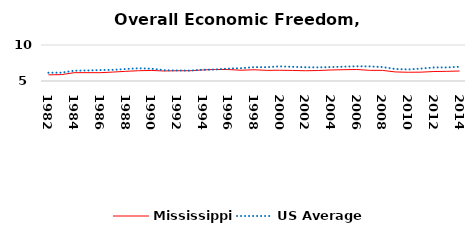
| Category | Mississippi | US Average |
|---|---|---|
| 1982.0 | 5.855 | 6.149 |
| 1983.0 | 5.883 | 6.152 |
| 1984.0 | 6.155 | 6.429 |
| 1985.0 | 6.158 | 6.464 |
| 1986.0 | 6.153 | 6.512 |
| 1987.0 | 6.238 | 6.552 |
| 1988.0 | 6.342 | 6.659 |
| 1989.0 | 6.428 | 6.767 |
| 1990.0 | 6.469 | 6.71 |
| 1991.0 | 6.391 | 6.502 |
| 1992.0 | 6.425 | 6.463 |
| 1993.0 | 6.426 | 6.446 |
| 1994.0 | 6.531 | 6.563 |
| 1995.0 | 6.606 | 6.593 |
| 1996.0 | 6.59 | 6.73 |
| 1997.0 | 6.494 | 6.781 |
| 1998.0 | 6.562 | 6.926 |
| 1999.0 | 6.478 | 6.925 |
| 2000.0 | 6.494 | 7.031 |
| 2001.0 | 6.466 | 6.969 |
| 2002.0 | 6.425 | 6.912 |
| 2003.0 | 6.457 | 6.892 |
| 2004.0 | 6.531 | 6.934 |
| 2005.0 | 6.572 | 6.99 |
| 2006.0 | 6.596 | 7.048 |
| 2007.0 | 6.48 | 7.028 |
| 2008.0 | 6.476 | 6.935 |
| 2009.0 | 6.259 | 6.668 |
| 2010.0 | 6.215 | 6.605 |
| 2011.0 | 6.229 | 6.72 |
| 2012.0 | 6.316 | 6.883 |
| 2013.0 | 6.343 | 6.881 |
| 2014.0 | 6.388 | 6.973 |